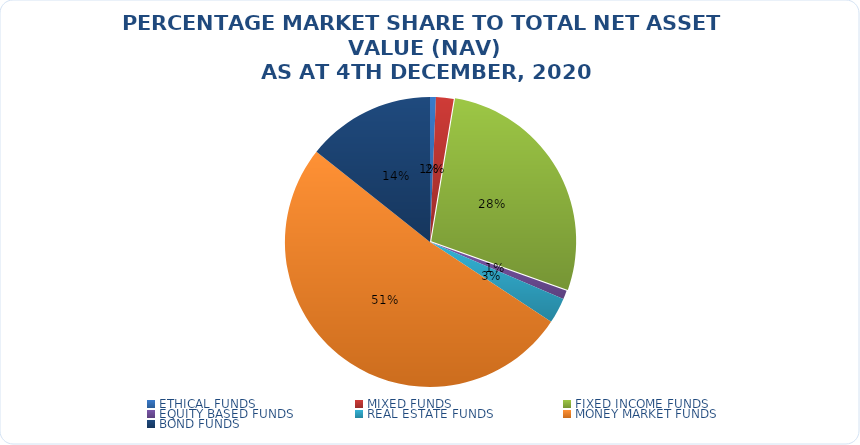
| Category | NET ASSET VALUE |
|---|---|
| ETHICAL FUNDS | 9680886012.01 |
| MIXED FUNDS | 29069195742.491 |
| FIXED INCOME FUNDS | 410887858524.86 |
| EQUITY BASED FUNDS | 14397003172.85 |
| REAL ESTATE FUNDS | 42245517361.359 |
| MONEY MARKET FUNDS | 759145393298.32 |
| BOND FUNDS | 211415946654.23 |